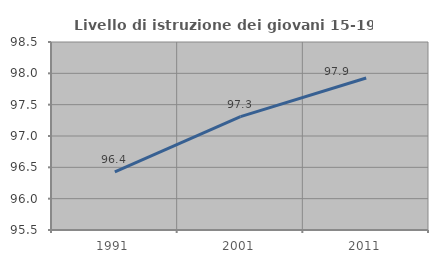
| Category | Livello di istruzione dei giovani 15-19 anni |
|---|---|
| 1991.0 | 96.429 |
| 2001.0 | 97.309 |
| 2011.0 | 97.925 |